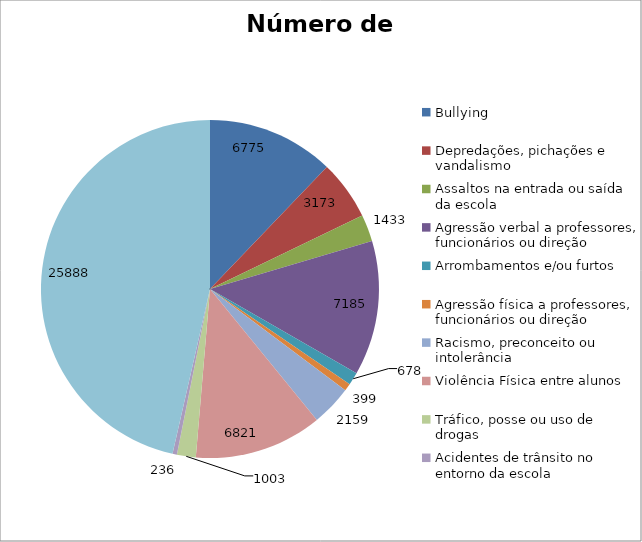
| Category | Número de Casos |
|---|---|
| Bullying | 6775 |
| Depredações, pichações e vandalismo | 3173 |
| Assaltos na entrada ou saída da escola | 1433 |
| Agressão verbal a professores, funcionários ou direção | 7185 |
| Arrombamentos e/ou furtos | 678 |
| Agressão física a professores, funcionários ou direção | 399 |
| Racismo, preconceito ou intolerância | 2159 |
| Violência Física entre alunos | 6821 |
| Tráfico, posse ou uso de drogas | 1003 |
| Acidentes de trânsito no entorno da escola | 236 |
| Indisciplina | 25888 |